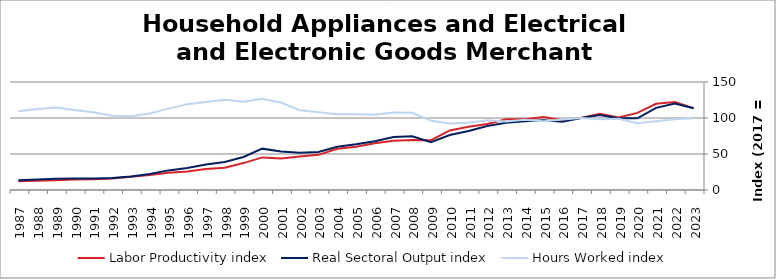
| Category | Labor Productivity index | Real Sectoral Output index | Hours Worked index |
|---|---|---|---|
| 2023.0 | 113.71 | 113.49 | 99.806 |
| 2022.0 | 122.138 | 120.16 | 98.38 |
| 2021.0 | 119.666 | 114.085 | 95.336 |
| 2020.0 | 107.151 | 99.499 | 92.859 |
| 2019.0 | 100.795 | 99.588 | 98.802 |
| 2018.0 | 105.842 | 104.129 | 98.381 |
| 2017.0 | 100 | 100 | 100 |
| 2016.0 | 96.947 | 94.777 | 97.761 |
| 2015.0 | 101.522 | 96.93 | 95.477 |
| 2014.0 | 98.112 | 95.641 | 97.482 |
| 2013.0 | 98.193 | 93.385 | 95.103 |
| 2012.0 | 91.64 | 88.877 | 96.985 |
| 2011.0 | 87.784 | 82.048 | 93.466 |
| 2010.0 | 82.66 | 76.325 | 92.335 |
| 2009.0 | 69.247 | 66.537 | 96.087 |
| 2008.0 | 69.506 | 74.546 | 107.252 |
| 2007.0 | 68.346 | 73.476 | 107.506 |
| 2006.0 | 64.88 | 67.766 | 104.448 |
| 2005.0 | 60.168 | 63.39 | 105.354 |
| 2004.0 | 57.174 | 60.066 | 105.057 |
| 2003.0 | 48.827 | 52.708 | 107.949 |
| 2002.0 | 46.598 | 51.621 | 110.78 |
| 2001.0 | 43.91 | 53.352 | 121.502 |
| 2000.0 | 45.264 | 57.43 | 126.878 |
| 1999.0 | 37.378 | 45.786 | 122.493 |
| 1998.0 | 31.013 | 38.905 | 125.45 |
| 1997.0 | 29.092 | 35.532 | 122.138 |
| 1996.0 | 25.766 | 30.649 | 118.949 |
| 1995.0 | 24.094 | 27.238 | 113.05 |
| 1994.0 | 20.901 | 22.199 | 106.213 |
| 1993.0 | 18.458 | 18.898 | 102.381 |
| 1992.0 | 16.125 | 16.616 | 103.048 |
| 1991.0 | 14.796 | 15.975 | 107.964 |
| 1990.0 | 14.479 | 16.094 | 111.154 |
| 1989.0 | 13.573 | 15.553 | 114.59 |
| 1988.0 | 12.883 | 14.495 | 112.512 |
| 1987.0 | 12.299 | 13.45 | 109.363 |